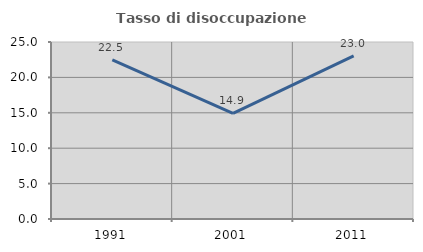
| Category | Tasso di disoccupazione giovanile  |
|---|---|
| 1991.0 | 22.459 |
| 2001.0 | 14.909 |
| 2011.0 | 23.041 |